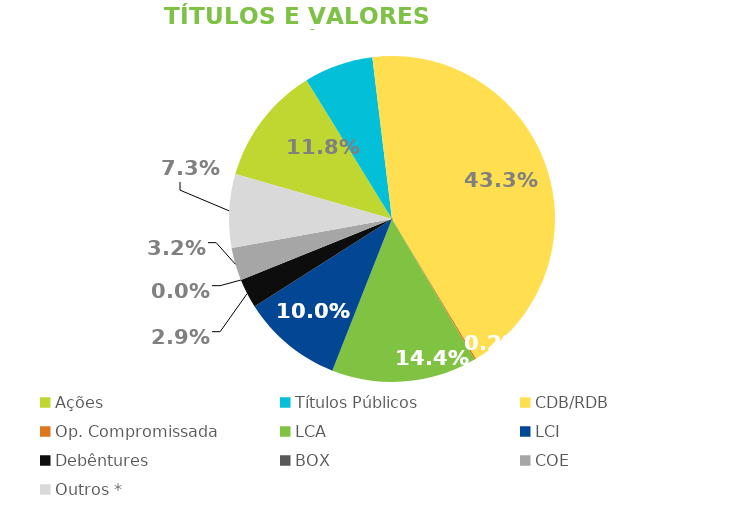
| Category | TVM |
|---|---|
| Ações | 0.118 |
| Títulos Públicos | 0.069 |
| CDB/RDB | 0.433 |
| Op. Compromissada | 0.002 |
| LCA | 0.144 |
| LCI | 0.1 |
| Debêntures | 0.029 |
| BOX | 0 |
| COE | 0.032 |
| Outros * | 0.073 |